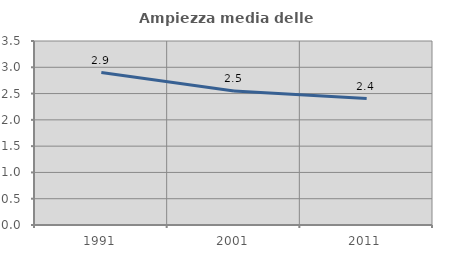
| Category | Ampiezza media delle famiglie |
|---|---|
| 1991.0 | 2.9 |
| 2001.0 | 2.55 |
| 2011.0 | 2.405 |